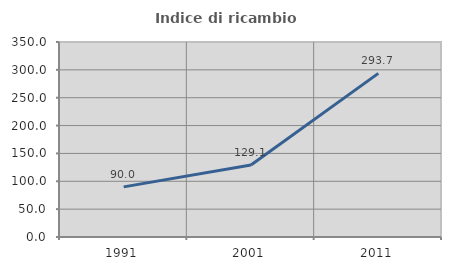
| Category | Indice di ricambio occupazionale  |
|---|---|
| 1991.0 | 89.967 |
| 2001.0 | 129.138 |
| 2011.0 | 293.699 |